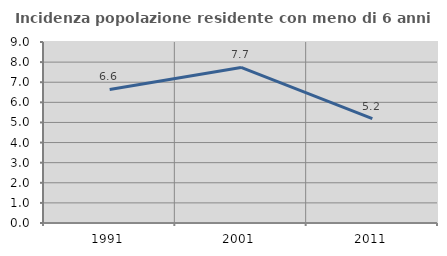
| Category | Incidenza popolazione residente con meno di 6 anni |
|---|---|
| 1991.0 | 6.639 |
| 2001.0 | 7.735 |
| 2011.0 | 5.189 |